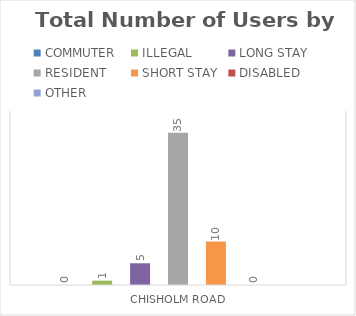
| Category | COMMUTER | ILLEGAL | LONG STAY | RESIDENT | SHORT STAY | DISABLED | OTHER |
|---|---|---|---|---|---|---|---|
| CHISHOLM ROAD | 0 | 1 | 5 | 35 | 10 | 0 | 0 |